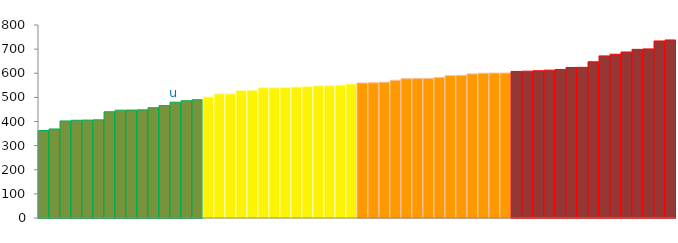
| Category | Top Quartile | 2nd Quartile | 3rd Quartile | Bottom Quartile | Series 4 |
|---|---|---|---|---|---|
|  | 362.7 | 0 | 0 | 0 | 362.7 |
|  | 369.1 | 0 | 0 | 0 | 369.1 |
|  | 402.3 | 0 | 0 | 0 | 402.3 |
|  | 405.1 | 0 | 0 | 0 | 405.1 |
|  | 405.9 | 0 | 0 | 0 | 405.9 |
|  | 406.9 | 0 | 0 | 0 | 406.9 |
|  | 440.3 | 0 | 0 | 0 | 440.3 |
|  | 446.9 | 0 | 0 | 0 | 446.9 |
|  | 447.4 | 0 | 0 | 0 | 447.4 |
|  | 448.2 | 0 | 0 | 0 | 448.2 |
|  | 457.2 | 0 | 0 | 0 | 457.2 |
|  | 465.9 | 0 | 0 | 0 | 465.9 |
| u | 480 | 0 | 0 | 0 | 480 |